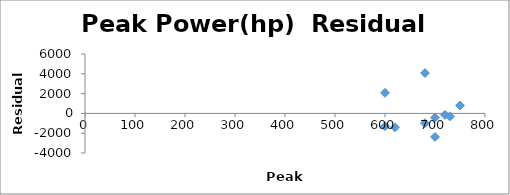
| Category | Series 0 |
|---|---|
| 600.0 | -1295.955 |
| 620.0 | -1401.764 |
| 700.0 | -2383.235 |
| 680.0 | -994.78 |
| 720.0 | -146.387 |
| 700.0 | -438.071 |
| 730.0 | -301.141 |
| 750.0 | 800.606 |
| 600.0 | 2081.076 |
| 680.0 | 4079.651 |